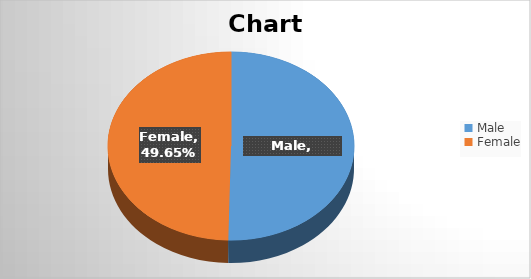
| Category | Series 0 |
|---|---|
| Male | 0.503 |
| Female | 0.497 |